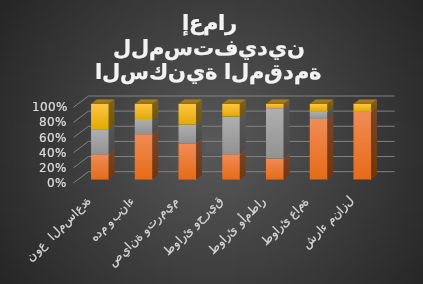
| Category | Series 0 | Series 1 | Series 2 | Series 3 |
|---|---|---|---|---|
| نوع  المساعدة |  | 2019 | 2020 | 2021 |
| هدم وبناء |  | 9 | 3 | 3 |
| صيانة وترميم |  | 45 | 24 | 26 |
| طوارئ وحريق |  | 4 | 6 | 2 |
| طوارئ وأمطار |  | 5 | 12 | 1 |
| طوارئ عامة |  | 8 | 1 | 1 |
| شراء منازل |  | 9 | 0 | 1 |